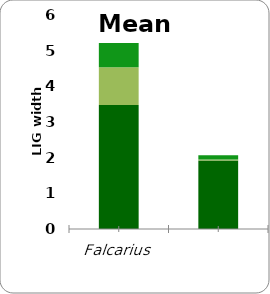
| Category | Series 0 | Series 1 | Series 2 | Series 3 |
|---|---|---|---|---|
| Falcarius | 0 | 3.479 | 1.057 | 0.678 |